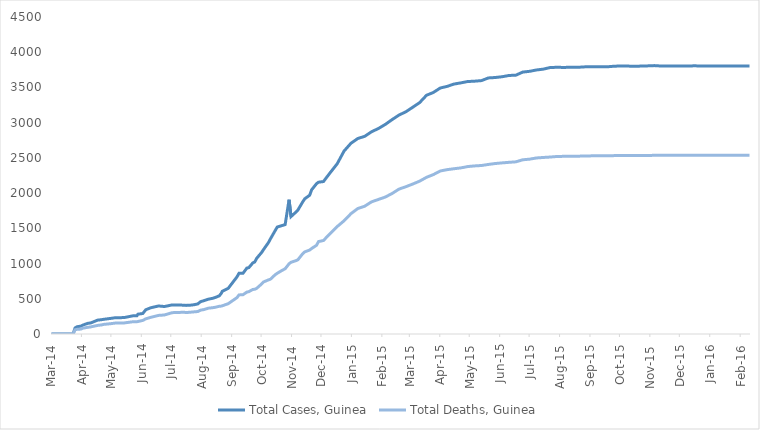
| Category | Total Cases, Guinea | Total Deaths, Guinea |
|---|---|---|
| 2014-03-01 | 0 | 0 |
| 2014-03-02 | 0 | 0 |
| 2014-03-03 | 0 | 0 |
| 2014-03-04 | 0 | 0 |
| 2014-03-05 | 0 | 0 |
| 2014-03-06 | 0 | 0 |
| 2014-03-07 | 0 | 0 |
| 2014-03-08 | 0 | 0 |
| 2014-03-09 | 0 | 0 |
| 2014-03-10 | 0 | 0 |
| 2014-03-11 | 0 | 0 |
| 2014-03-12 | 0 | 0 |
| 2014-03-13 | 0 | 0 |
| 2014-03-14 | 0 | 0 |
| 2014-03-15 | 0 | 0 |
| 2014-03-16 | 0 | 0 |
| 2014-03-17 | 0 | 0 |
| 2014-03-18 | 0 | 0 |
| 2014-03-19 | 0 | 0 |
| 2014-03-20 | 0 | 0 |
| 2014-03-21 | 0 | 0 |
| 2014-03-22 | 0 | 0 |
| 2014-03-23 | 0 | 0 |
| 2014-03-24 | 0 | 0 |
| 2014-03-25 | 86 | 59 |
| 2014-03-26 | 86 | 60 |
| 2014-03-27 | 103 | 66 |
| 2014-03-31 | 112 | 70 |
| 2014-04-01 | 122 | 80 |
| 2014-04-02 | 127 | 83 |
| 2014-04-07 | 151 | 95 |
| 2014-04-10 | 157 | 101 |
| 2014-04-17 | 197 | 122 |
| 2014-04-21 | 203 | 129 |
| 2014-04-23 | 208 | 136 |
| 2014-04-30 | 221 | 146 |
| 2014-05-05 | 231 | 155 |
| 2014-05-14 | 233 | 157 |
| 2014-05-23 | 258 | 174 |
| 2014-05-27 | 258 | 174 |
| 2014-05-28 | 281 | 186 |
| 2014-06-02 | 291 | 193 |
| 2014-06-05 | 344 | 215 |
| 2014-06-10 | 372 | 236 |
| 2014-06-11 | 376 | 241 |
| 2014-06-18 | 398 | 264 |
| 2014-06-24 | 390 | 270 |
| 2014-07-02 | 413 | 303 |
| 2014-07-07 | 412 | 305 |
| 2014-07-08 | 408 | 307 |
| 2014-07-14 | 409 | 309 |
| 2014-07-16 | 406 | 304 |
| 2014-07-21 | 410 | 310 |
| 2014-07-24 | 415 | 314 |
| 2014-07-28 | 427 | 319 |
| 2014-07-31 | 460 | 339 |
| 2014-08-03 | 472 | 346 |
| 2014-08-04 | 485 | 358 |
| 2014-08-08 | 495 | 367 |
| 2014-08-12 | 506 | 373 |
| 2014-08-13 | 510 | 377 |
| 2014-08-15 | 519 | 380 |
| 2014-08-19 | 543 | 394 |
| 2014-08-21 | 579 | 396 |
| 2014-08-22 | 607 | 406 |
| 2014-08-28 | 648 | 430 |
| 2014-09-06 | 812 | 517 |
| 2014-09-08 | 862 | 555 |
| 2014-09-12 | 861 | 557 |
| 2014-09-16 | 936 | 595 |
| 2014-09-18 | 942 | 601 |
| 2014-09-22 | 1008 | 632 |
| 2014-09-24 | 1022 | 635 |
| 2014-09-26 | 1074 | 648 |
| 2014-10-01 | 1157 | 710 |
| 2014-10-03 | 1199 | 739 |
| 2014-10-08 | 1298 | 768 |
| 2014-10-10 | 1350 | 778 |
| 2014-10-15 | 1472 | 843 |
| 2014-10-17 | 1519 | 862 |
| 2014-10-22 | 1540 | 904 |
| 2014-10-25 | 1553 | 926 |
| 2014-10-29 | 1906 | 997 |
| 2014-10-31 | 1667 | 1018 |
| 2014-11-05 | 1731 | 1041 |
| 2014-11-07 | 1760 | 1054 |
| 2014-11-12 | 1878 | 1142 |
| 2014-11-14 | 1919 | 1166 |
| 2014-11-19 | 1971 | 1192 |
| 2014-11-21 | 2047 | 1214 |
| 2014-11-26 | 2134 | 1260 |
| 2014-11-28 | 2155 | 1312 |
| 2014-12-03 | 2164 | 1327 |
| 2014-12-10 | 2292 | 1428 |
| 2014-12-17 | 2416 | 1525 |
| 2014-12-24 | 2597 | 1607 |
| 2014-12-31 | 2707 | 1708 |
| 2015-01-07 | 2775 | 1781 |
| 2015-01-14 | 2806 | 1814 |
| 2015-01-21 | 2871 | 1876 |
| 2015-01-28 | 2917 | 1910 |
| 2015-02-04 | 2975 | 1944 |
| 2015-02-11 | 3044 | 1995 |
| 2015-02-18 | 3108 | 2057 |
| 2015-02-25 | 3155 | 2091 |
| 2015-03-04 | 3219 | 2129 |
| 2015-03-11 | 3285 | 2170 |
| 2015-03-18 | 3389 | 2224 |
| 2015-03-25 | 3429 | 2263 |
| 2015-04-01 | 3492 | 2314 |
| 2015-04-08 | 3515 | 2333 |
| 2015-04-15 | 3548 | 2346 |
| 2015-04-22 | 3565 | 2358 |
| 2015-04-29 | 3584 | 2377 |
| 2015-05-06 | 3589 | 2386 |
| 2015-05-13 | 3597 | 2392 |
| 2015-05-20 | 3635 | 2407 |
| 2015-05-27 | 3641 | 2420 |
| 2015-06-03 | 3652 | 2429 |
| 2015-06-10 | 3670 | 2437 |
| 2015-06-17 | 3674 | 2444 |
| 2015-06-24 | 3718 | 2473 |
| 2015-07-01 | 3729 | 2482 |
| 2015-07-08 | 3748 | 2499 |
| 2015-07-15 | 3760 | 2506 |
| 2015-07-22 | 3783 | 2512 |
| 2015-07-29 | 3786 | 2520 |
| 2015-08-05 | 3784 | 2522 |
| 2015-08-12 | 3787 | 2524 |
| 2015-08-19 | 3786 | 2524 |
| 2015-08-26 | 3792 | 2527 |
| 2015-09-03 | 3792 | 2529 |
| 2015-09-10 | 3792 | 2530 |
| 2015-09-17 | 3792 | 2530 |
| 2015-09-24 | 3800 | 2532 |
| 2015-10-01 | 3805 | 2533 |
| 2015-10-08 | 3804 | 2534 |
| 2015-10-15 | 3800 | 2534 |
| 2015-10-22 | 3803 | 2535 |
| 2015-10-29 | 3806 | 2535 |
| 2015-11-05 | 3810 | 2536 |
| 2015-11-11 | 3805 | 2536 |
| 2015-11-18 | 3804 | 2536 |
| 2015-11-25 | 3804 | 2536 |
| 2015-12-02 | 3804 | 2536 |
| 2015-12-09 | 3804 | 2536 |
| 2015-12-16 | 3807 | 2536 |
| 2015-12-23 | 3804 | 2536 |
| 2015-12-30 | 3804 | 2536 |
| 2016-01-06 | 3804 | 2536 |
| 2016-01-13 | 3804 | 2536 |
| 2016-01-20 | 3804 | 2536 |
| 2016-01-27 | 3804 | 2536 |
| 2016-02-03 | 3804 | 2536 |
| 2016-02-10 | 3804 | 2536 |